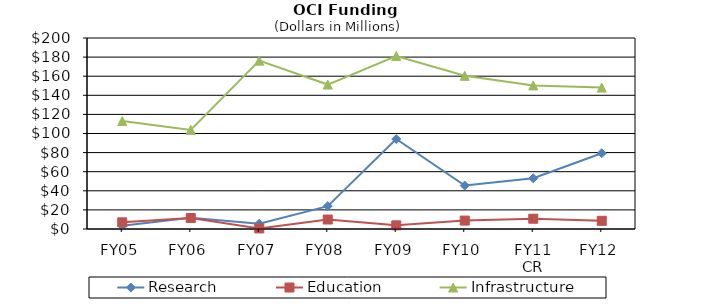
| Category | Research | Education | Infrastructure |
|---|---|---|---|
| FY05 | 3.41 | 6.98 | 113.01 |
| FY06 | 11.9 | 11.48 | 103.76 |
| FY07 | 5.57 | 0.57 | 176.28 |
| FY08 | 23.97 | 9.93 | 151.25 |
| FY09 | 94.21 | 3.85 | 181.17 |
| FY10 | 45.51 | 8.81 | 160.4 |
| FY11
CR | 53.13 | 10.77 | 150.38 |
| FY12 | 79.36 | 8.6 | 148.06 |